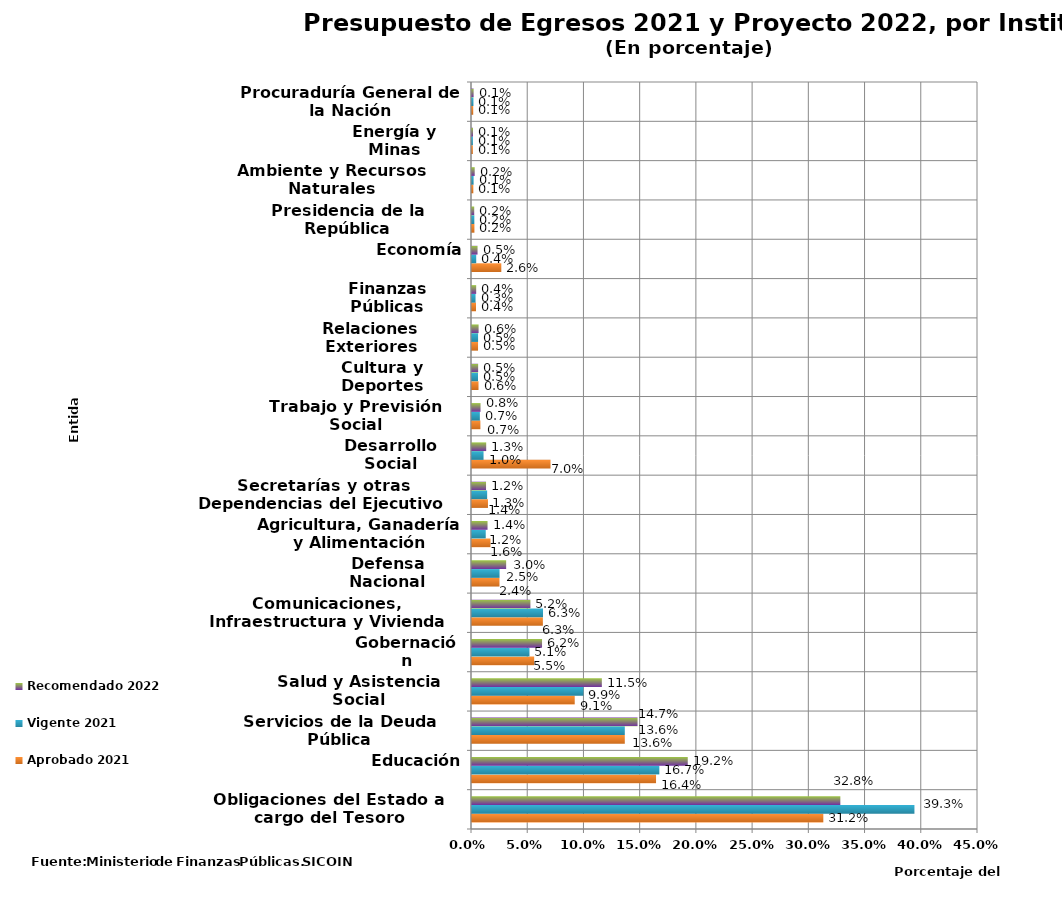
| Category | Aprobado 2021 | Vigente 2021 | Recomendado 2022 |
|---|---|---|---|
| Obligaciones del Estado a cargo del Tesoro | 0.312 | 0.393 | 0.328 |
| Educación | 0.164 | 0.167 | 0.192 |
| Servicios de la Deuda Pública | 0.136 | 0.136 | 0.147 |
| Salud y Asistencia Social | 0.091 | 0.099 | 0.115 |
| Gobernación | 0.055 | 0.051 | 0.062 |
| Comunicaciones, Infraestructura y Vivienda | 0.063 | 0.063 | 0.052 |
| Defensa Nacional | 0.024 | 0.025 | 0.03 |
| Agricultura, Ganadería y Alimentación | 0.016 | 0.012 | 0.014 |
| Secretarías y otras Dependencias del Ejecutivo | 0.014 | 0.013 | 0.012 |
| Desarrollo Social | 0.07 | 0.01 | 0.013 |
| Trabajo y Previsión Social | 0.007 | 0.007 | 0.008 |
| Cultura y Deportes | 0.006 | 0.005 | 0.005 |
| Relaciones Exteriores | 0.005 | 0.005 | 0.006 |
| Finanzas Públicas | 0.004 | 0.003 | 0.004 |
| Economía | 0.026 | 0.004 | 0.005 |
| Presidencia de la República | 0.002 | 0.002 | 0.002 |
| Ambiente y Recursos Naturales | 0.001 | 0.001 | 0.002 |
| Energía y Minas | 0.001 | 0.001 | 0.001 |
| Procuraduría General de la Nación | 0.001 | 0.001 | 0.001 |